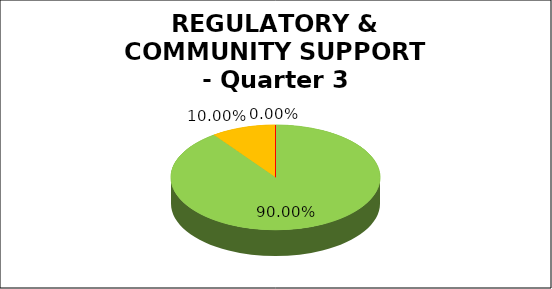
| Category | Q3 |
|---|---|
| Green | 0.9 |
| Amber | 0.1 |
| Red | 0 |